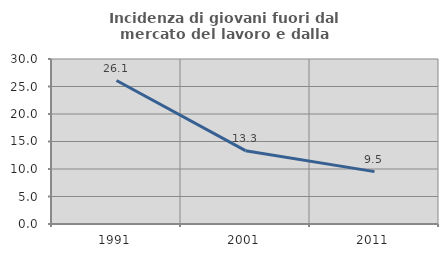
| Category | Incidenza di giovani fuori dal mercato del lavoro e dalla formazione  |
|---|---|
| 1991.0 | 26.087 |
| 2001.0 | 13.333 |
| 2011.0 | 9.524 |